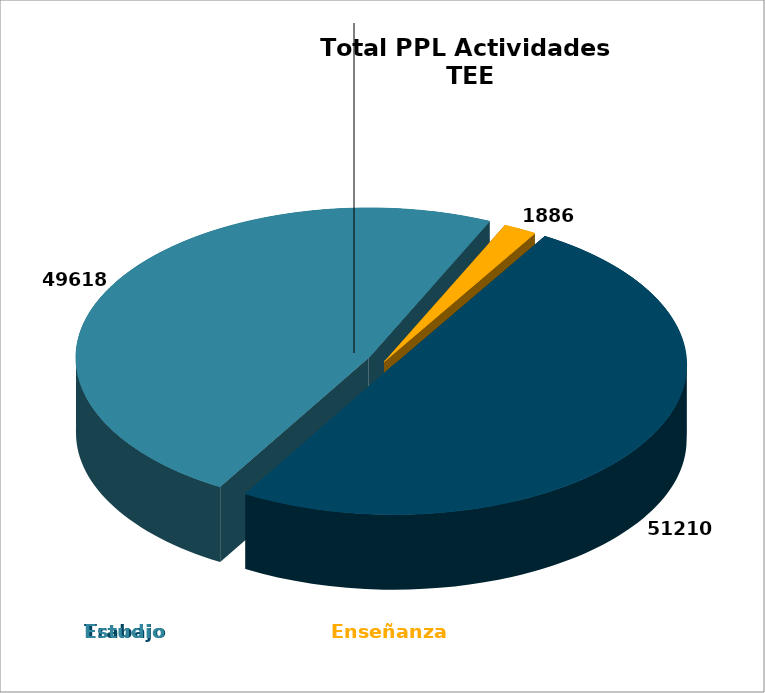
| Category | Trabajo | Estudio | Enseñanza |
|---|---|---|---|
| 51210.0 | 51210 |  |  |